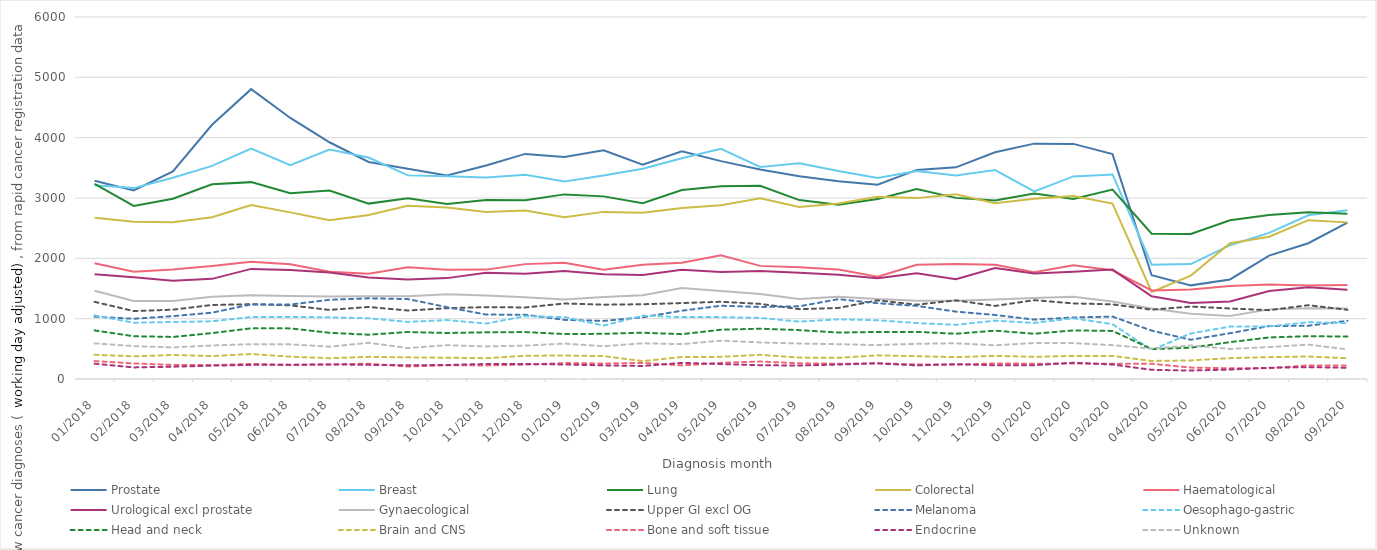
| Category | Prostate | Breast | Lung | Colorectal | Haematological | Urological excl prostate | Gynaecological | Upper GI excl OG | Melanoma | Oesophago-gastric | Head and neck | Brain and CNS | Bone and soft tissue | Endocrine | Unknown |
|---|---|---|---|---|---|---|---|---|---|---|---|---|---|---|---|
| 2018-01-01 | 3286 | 3213 | 3234 | 2672 | 1919 | 1737 | 1464 | 1279 | 1034 | 1055 | 805 | 401 | 297 | 254 | 591 |
| 2018-02-01 | 3124 | 3164 | 2869 | 2606 | 1778 | 1687 | 1292 | 1126 | 998 | 933 | 709 | 376 | 258 | 192 | 545 |
| 2018-03-01 | 3442 | 3336 | 2989 | 2598 | 1815 | 1629 | 1294 | 1149 | 1042 | 945 | 697 | 398 | 234 | 204 | 524 |
| 2018-04-01 | 4213 | 3532 | 3226 | 2680 | 1873 | 1660 | 1365 | 1227 | 1099 | 956 | 761 | 380 | 231 | 221 | 555 |
| 2018-05-01 | 4804 | 3819 | 3263 | 2884 | 1945 | 1825 | 1389 | 1240 | 1236 | 1027 | 840 | 414 | 251 | 234 | 578 |
| 2018-06-01 | 4327 | 3545 | 3078 | 2762 | 1900 | 1807 | 1375 | 1220 | 1234 | 1029 | 839 | 370 | 233 | 236 | 574 |
| 2018-07-01 | 3924 | 3802 | 3124 | 2631 | 1777 | 1767 | 1367 | 1145 | 1313 | 1023 | 766 | 345 | 242 | 241 | 536 |
| 2018-08-01 | 3597 | 3670 | 2907 | 2720 | 1744 | 1681 | 1371 | 1194 | 1337 | 1006 | 734 | 367 | 254 | 235 | 600 |
| 2018-09-01 | 3483 | 3375 | 2995 | 2870 | 1852 | 1649 | 1373 | 1135 | 1325 | 946 | 779 | 359 | 206 | 228 | 513 |
| 2018-10-01 | 3372 | 3362 | 2902 | 2842 | 1810 | 1672 | 1403 | 1173 | 1191 | 977 | 762 | 352 | 229 | 232 | 560 |
| 2018-11-01 | 3539 | 3339 | 2968 | 2769 | 1813 | 1759 | 1386 | 1191 | 1068 | 919 | 774 | 345 | 225 | 249 | 540 |
| 2018-12-01 | 3731 | 3384 | 2961 | 2794 | 1904 | 1744 | 1353 | 1186 | 1065 | 1041 | 778 | 385 | 239 | 248 | 553 |
| 2019-01-01 | 3681 | 3274 | 3060 | 2681 | 1927 | 1791 | 1319 | 1251 | 980 | 1027 | 745 | 390 | 264 | 241 | 587 |
| 2019-02-01 | 3792 | 3373 | 3027 | 2770 | 1811 | 1735 | 1359 | 1232 | 962 | 885 | 749 | 379 | 257 | 226 | 543 |
| 2019-03-01 | 3551 | 3484 | 2913 | 2756 | 1894 | 1724 | 1389 | 1239 | 1023 | 1049 | 767 | 297 | 267 | 216 | 592 |
| 2019-04-01 | 3774 | 3660 | 3132 | 2834 | 1928 | 1811 | 1508 | 1259 | 1132 | 1026 | 743 | 364 | 225 | 267 | 578 |
| 2019-05-01 | 3611 | 3814 | 3195 | 2879 | 2049 | 1773 | 1457 | 1280 | 1214 | 1026 | 817 | 367 | 268 | 247 | 636 |
| 2019-06-01 | 3471 | 3515 | 3204 | 2994 | 1875 | 1789 | 1407 | 1245 | 1194 | 1013 | 834 | 401 | 289 | 229 | 606 |
| 2019-07-01 | 3362 | 3576 | 2965 | 2852 | 1852 | 1761 | 1326 | 1158 | 1205 | 951 | 810 | 355 | 261 | 223 | 588 |
| 2019-08-01 | 3279 | 3447 | 2888 | 2909 | 1813 | 1728 | 1363 | 1178 | 1323 | 989 | 770 | 351 | 252 | 240 | 577 |
| 2019-09-01 | 3220 | 3332 | 2983 | 3021 | 1694 | 1669 | 1327 | 1303 | 1256 | 974 | 780 | 392 | 262 | 258 | 562 |
| 2019-10-01 | 3466 | 3447 | 3148 | 2998 | 1894 | 1754 | 1298 | 1232 | 1212 | 927 | 781 | 378 | 241 | 226 | 584 |
| 2019-11-01 | 3508 | 3373 | 3002 | 3062 | 1905 | 1655 | 1297 | 1304 | 1117 | 898 | 750 | 362 | 236 | 247 | 592 |
| 2019-12-01 | 3757 | 3464 | 2958 | 2914 | 1892 | 1841 | 1316 | 1211 | 1061 | 966 | 801 | 384 | 258 | 228 | 558 |
| 2020-01-01 | 3901 | 3109 | 3073 | 2986 | 1770 | 1748 | 1344 | 1307 | 984 | 930 | 750 | 367 | 253 | 229 | 596 |
| 2020-02-01 | 3897 | 3358 | 2985 | 3033 | 1884 | 1779 | 1365 | 1253 | 1019 | 1006 | 805 | 383 | 257 | 269 | 595 |
| 2020-03-01 | 3728 | 3391 | 3140 | 2908 | 1801 | 1813 | 1285 | 1237 | 1035 | 909 | 797 | 383 | 253 | 240 | 561 |
| 2020-04-01 | 1720 | 1894 | 2408 | 1444 | 1467 | 1370 | 1170 | 1149 | 802 | 480 | 496 | 299 | 252 | 152 | 504 |
| 2020-05-01 | 1552 | 1905 | 2405 | 1714 | 1485 | 1258 | 1083 | 1201 | 650 | 755 | 519 | 308 | 189 | 140 | 556 |
| 2020-06-01 | 1650 | 2218 | 2630 | 2249 | 1542 | 1285 | 1043 | 1169 | 759 | 869 | 611 | 346 | 178 | 157 | 498 |
| 2020-07-01 | 2046 | 2421 | 2719 | 2357 | 1567 | 1459 | 1154 | 1141 | 877 | 872 | 688 | 362 | 178 | 187 | 529 |
| 2020-08-01 | 2250 | 2713 | 2764 | 2633 | 1550 | 1519 | 1173 | 1223 | 883 | 941 | 709 | 373 | 226 | 196 | 570 |
| 2020-09-01 | 2593 | 2797 | 2741 | 2596 | 1559 | 1481 | 1168 | 1147 | 964 | 927 | 704 | 344 | 223 | 186 | 491 |